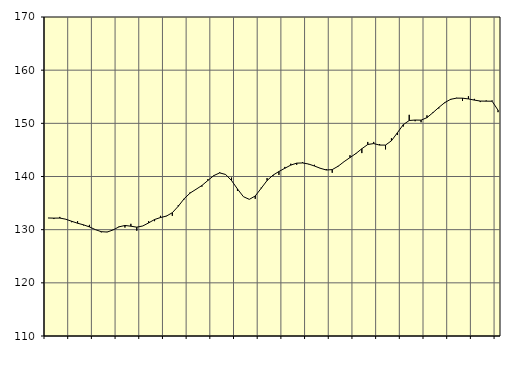
| Category | Piggar | Samtliga sysselsatta (inkl. sysselsatta utomlands) |
|---|---|---|
| nan | 132.2 | 132.2 |
| 1.0 | 132 | 132.17 |
| 1.0 | 132.4 | 132.18 |
| 1.0 | 132 | 131.97 |
| nan | 131.4 | 131.58 |
| 2.0 | 131.6 | 131.21 |
| 2.0 | 130.8 | 130.91 |
| 2.0 | 130.9 | 130.52 |
| nan | 130 | 130.01 |
| 3.0 | 129.5 | 129.62 |
| 3.0 | 129.6 | 129.55 |
| 3.0 | 130 | 129.95 |
| nan | 130.6 | 130.53 |
| 4.0 | 130.4 | 130.79 |
| 4.0 | 131.1 | 130.65 |
| 4.0 | 129.8 | 130.47 |
| nan | 130.7 | 130.69 |
| 5.0 | 131.6 | 131.27 |
| 5.0 | 131.6 | 131.91 |
| 5.0 | 132.6 | 132.28 |
| nan | 132.6 | 132.55 |
| 6.0 | 132.6 | 133.19 |
| 6.0 | 134.6 | 134.4 |
| 6.0 | 135.7 | 135.82 |
| nan | 137 | 136.88 |
| 7.0 | 137.6 | 137.59 |
| 7.0 | 138.1 | 138.31 |
| 7.0 | 139.5 | 139.25 |
| nan | 140.1 | 140.17 |
| 8.0 | 140.8 | 140.68 |
| 8.0 | 140.4 | 140.38 |
| 8.0 | 139.8 | 139.24 |
| nan | 137.3 | 137.66 |
| 9.0 | 136.2 | 136.21 |
| 9.0 | 135.7 | 135.7 |
| 9.0 | 135.8 | 136.33 |
| nan | 137.9 | 137.77 |
| 10.0 | 139.7 | 139.24 |
| 10.0 | 140.1 | 140.25 |
| 10.0 | 140.3 | 140.94 |
| nan | 141.8 | 141.55 |
| 11.0 | 142.4 | 142.14 |
| 11.0 | 142.2 | 142.51 |
| 11.0 | 142.7 | 142.55 |
| nan | 142.3 | 142.35 |
| 12.0 | 142.2 | 141.97 |
| 12.0 | 141.6 | 141.54 |
| 12.0 | 141.4 | 141.22 |
| nan | 140.7 | 141.3 |
| 13.0 | 142 | 141.93 |
| 13.0 | 142.8 | 142.79 |
| 13.0 | 144 | 143.56 |
| nan | 144.4 | 144.32 |
| 14.0 | 144.4 | 145.22 |
| 14.0 | 146.5 | 146.02 |
| 14.0 | 146.5 | 146.19 |
| nan | 146.1 | 145.91 |
| 15.0 | 145.1 | 145.91 |
| 15.0 | 147.2 | 146.72 |
| 15.0 | 147.8 | 148.22 |
| nan | 149.4 | 149.75 |
| 16.0 | 151.6 | 150.53 |
| 16.0 | 150.4 | 150.62 |
| 16.0 | 150.2 | 150.6 |
| nan | 151.5 | 151.07 |
| 17.0 | 152.1 | 152 |
| 17.0 | 152.8 | 152.99 |
| 17.0 | 153.8 | 153.9 |
| nan | 154.4 | 154.52 |
| 18.0 | 154.8 | 154.74 |
| 18.0 | 154.2 | 154.73 |
| 18.0 | 155.1 | 154.59 |
| nan | 154.6 | 154.37 |
| 19.0 | 154 | 154.19 |
| 19.0 | 154.3 | 154.17 |
| 19.0 | 154.3 | 154.16 |
| nan | 152.1 | 152.47 |